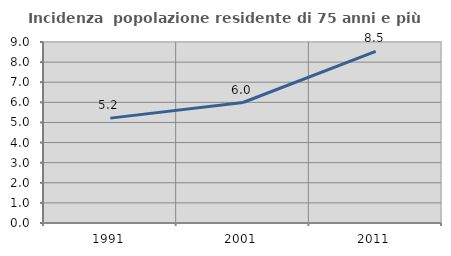
| Category | Incidenza  popolazione residente di 75 anni e più |
|---|---|
| 1991.0 | 5.214 |
| 2001.0 | 5.991 |
| 2011.0 | 8.537 |